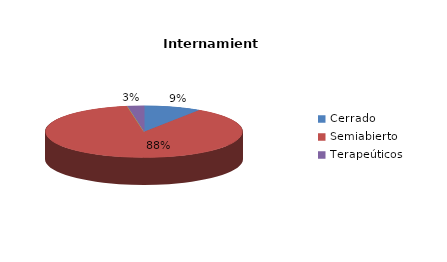
| Category | Series 0 |
|---|---|
| Cerrado | 7 |
| Semiabierto | 66 |
| Abierto | 0 |
| Terapeúticos | 2 |